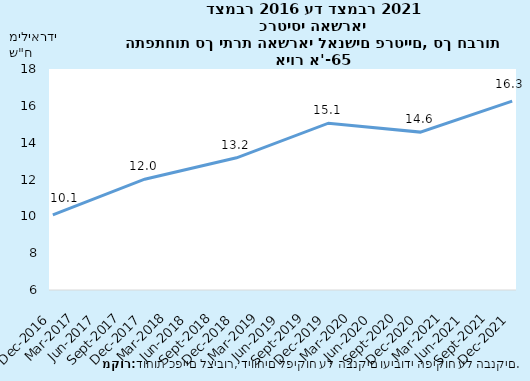
| Category | Series 0 |
|---|---|
| 2016-12-31 | 10.081 |
| 2017-12-31 | 12.015 |
| 2018-12-31 | 13.178 |
| 2019-12-31 | 15.057 |
| 2020-12-31 | 14.573 |
| 2021-12-31 | 16.254 |